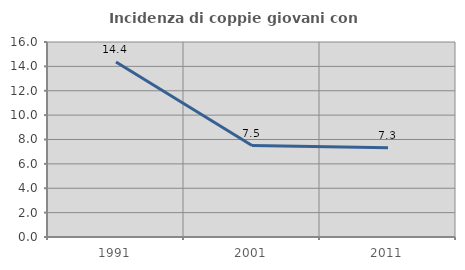
| Category | Incidenza di coppie giovani con figli |
|---|---|
| 1991.0 | 14.365 |
| 2001.0 | 7.504 |
| 2011.0 | 7.329 |